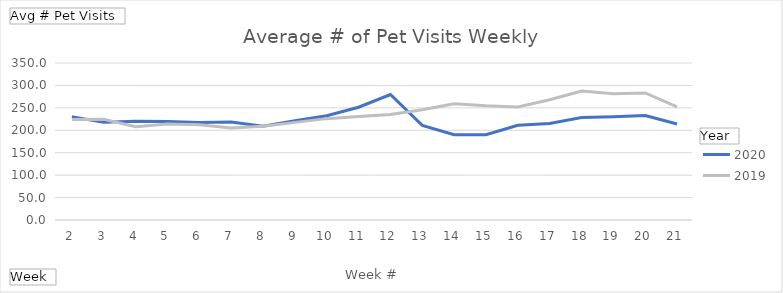
| Category | 2020 | 2019 |
|---|---|---|
| 2 | 230.37 | 224.247 |
| 3 | 217.658 | 224.658 |
| 4 | 220.055 | 208.164 |
| 5 | 219.836 | 214.123 |
| 6 | 217.507 | 212.384 |
| 7 | 218.356 | 205.082 |
| 8 | 209.068 | 209.041 |
| 9 | 221.479 | 217.616 |
| 10 | 232.562 | 225.973 |
| 11 | 251.384 | 230.726 |
| 12 | 279.808 | 235.288 |
| 13 | 210.959 | 245.575 |
| 14 | 190 | 258.973 |
| 15 | 190.082 | 254.534 |
| 16 | 211.329 | 251.877 |
| 17 | 215.192 | 268.137 |
| 18 | 228.466 | 287.63 |
| 19 | 230.192 | 281.493 |
| 20 | 232.822 | 283.151 |
| 21 | 214.041 | 252.452 |